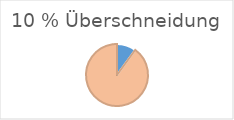
| Category | Series 0 |
|---|---|
| 0 | 10 |
| 1 | 90 |